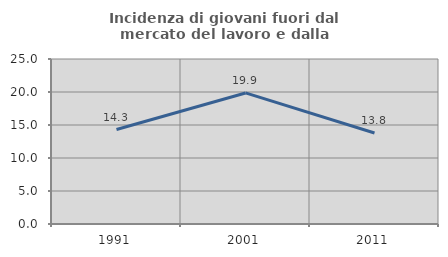
| Category | Incidenza di giovani fuori dal mercato del lavoro e dalla formazione  |
|---|---|
| 1991.0 | 14.315 |
| 2001.0 | 19.858 |
| 2011.0 | 13.794 |